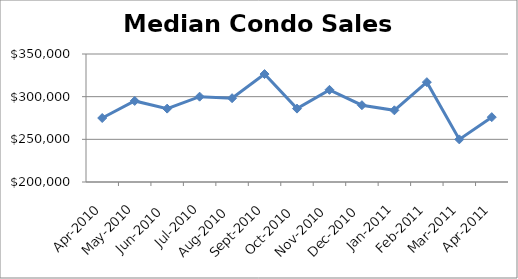
| Category | Series 0 |
|---|---|
| 2010-04-01 | 275000 |
| 2010-05-01 | 295000 |
| 2010-06-01 | 286000 |
| 2010-07-01 | 300000 |
| 2010-08-01 | 298225 |
| 2010-09-01 | 326500 |
| 2010-10-01 | 286000 |
| 2010-11-01 | 308000 |
| 2010-12-01 | 290000 |
| 2011-01-01 | 284000 |
| 2011-02-01 | 317000 |
| 2011-03-01 | 249950 |
| 2011-04-01 | 276000 |